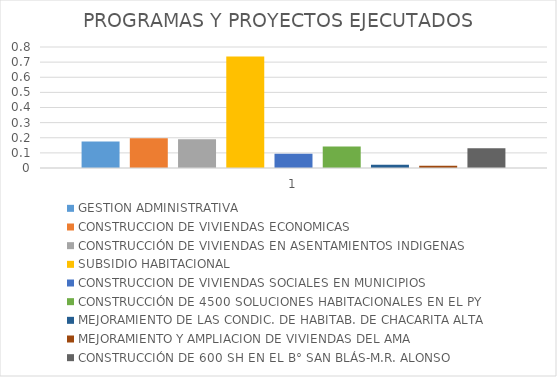
| Category | GESTION ADMINISTRATIVA | CONSTRUCCION DE VIVIENDAS ECONOMICAS | CONSTRUCCIÓN DE VIVIENDAS EN ASENTAMIENTOS INDIGENAS | SUBSIDIO HABITACIONAL | CONSTRUCCION DE VIVIENDAS SOCIALES EN MUNICIPIOS | CONSTRUCCIÓN DE 4500 SOLUCIONES HABITACIONALES EN EL PY | MEJORAMIENTO DE LAS CONDIC. DE HABITAB. DE CHACARITA ALTA | MEJORAMIENTO Y AMPLIACION DE VIVIENDAS DEL AMA | CONSTRUCCIÓN DE 600 SH EN EL B° SAN BLÁS-M.R. ALONSO |
|---|---|---|---|---|---|---|---|---|---|
| 0 | 0.175 | 0.196 | 0.191 | 0.737 | 0.095 | 0.142 | 0.021 | 0.015 | 0.131 |